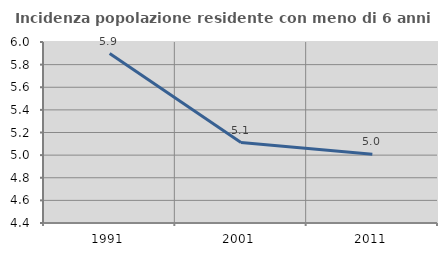
| Category | Incidenza popolazione residente con meno di 6 anni |
|---|---|
| 1991.0 | 5.897 |
| 2001.0 | 5.111 |
| 2011.0 | 5.008 |